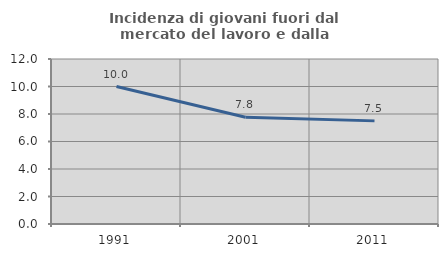
| Category | Incidenza di giovani fuori dal mercato del lavoro e dalla formazione  |
|---|---|
| 1991.0 | 10 |
| 2001.0 | 7.759 |
| 2011.0 | 7.5 |